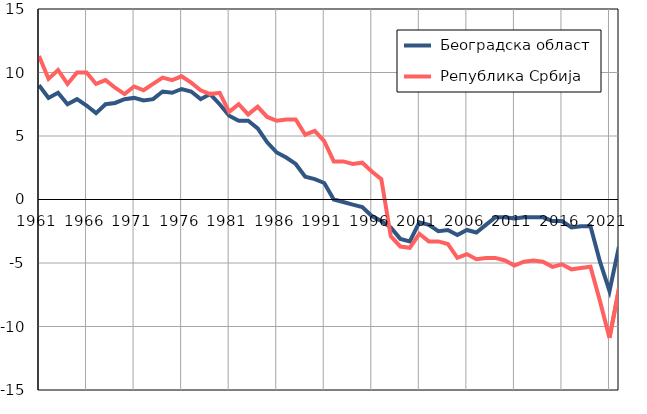
| Category |  Београдска област |  Република Србија |
|---|---|---|
| 1961.0 | 9 | 11.3 |
| 1962.0 | 8 | 9.5 |
| 1963.0 | 8.4 | 10.2 |
| 1964.0 | 7.5 | 9.1 |
| 1965.0 | 7.9 | 10 |
| 1966.0 | 7.4 | 10 |
| 1967.0 | 6.8 | 9.1 |
| 1968.0 | 7.5 | 9.4 |
| 1969.0 | 7.6 | 8.8 |
| 1970.0 | 7.9 | 8.3 |
| 1971.0 | 8 | 8.9 |
| 1972.0 | 7.8 | 8.6 |
| 1973.0 | 7.9 | 9.1 |
| 1974.0 | 8.5 | 9.6 |
| 1975.0 | 8.4 | 9.4 |
| 1976.0 | 8.7 | 9.7 |
| 1977.0 | 8.5 | 9.2 |
| 1978.0 | 7.9 | 8.6 |
| 1979.0 | 8.3 | 8.3 |
| 1980.0 | 7.5 | 8.4 |
| 1981.0 | 6.6 | 6.9 |
| 1982.0 | 6.2 | 7.5 |
| 1983.0 | 6.2 | 6.7 |
| 1984.0 | 5.6 | 7.3 |
| 1985.0 | 4.5 | 6.5 |
| 1986.0 | 3.7 | 6.2 |
| 1987.0 | 3.3 | 6.3 |
| 1988.0 | 2.8 | 6.3 |
| 1989.0 | 1.8 | 5.1 |
| 1990.0 | 1.6 | 5.4 |
| 1991.0 | 1.3 | 4.6 |
| 1992.0 | 0 | 3 |
| 1993.0 | -0.2 | 3 |
| 1994.0 | -0.4 | 2.8 |
| 1995.0 | -0.6 | 2.9 |
| 1996.0 | -1.3 | 2.2 |
| 1997.0 | -1.7 | 1.6 |
| 1998.0 | -2.2 | -2.9 |
| 1999.0 | -3.1 | -3.7 |
| 2000.0 | -3.3 | -3.8 |
| 2001.0 | -1.8 | -2.7 |
| 2002.0 | -2 | -3.3 |
| 2003.0 | -2.5 | -3.3 |
| 2004.0 | -2.4 | -3.5 |
| 2005.0 | -2.8 | -4.6 |
| 2006.0 | -2.4 | -4.3 |
| 2007.0 | -2.6 | -4.7 |
| 2008.0 | -2 | -4.6 |
| 2009.0 | -1.4 | -4.6 |
| 2010.0 | -1.4 | -4.8 |
| 2011.0 | -1.5 | -5.2 |
| 2012.0 | -1.4 | -4.9 |
| 2013.0 | -1.4 | -4.8 |
| 2014.0 | -1.4 | -4.9 |
| 2015.0 | -1.7 | -5.3 |
| 2016.0 | -1.7 | -5.1 |
| 2017.0 | -2.2 | -5.5 |
| 2018.0 | -2.1 | -5.4 |
| 2019.0 | -2.1 | -5.3 |
| 2020.0 | -4.9 | -8 |
| 2021.0 | -7.2 | -10.9 |
| 2022.0 | -3.7 | -7 |